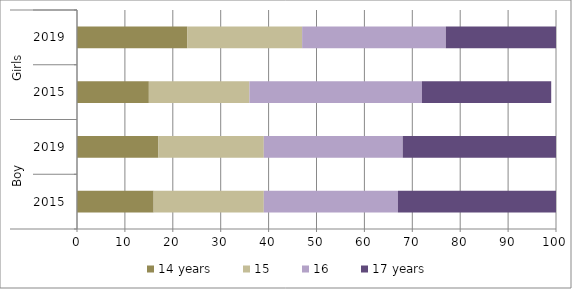
| Category | 14 years | 15 | 16 | 17 years |
|---|---|---|---|---|
| 0 | 16 | 23 | 28 | 33 |
| 1 | 17 | 22 | 29 | 32 |
| 2 | 15 | 21 | 36 | 27 |
| 3 | 23 | 24 | 30 | 23 |